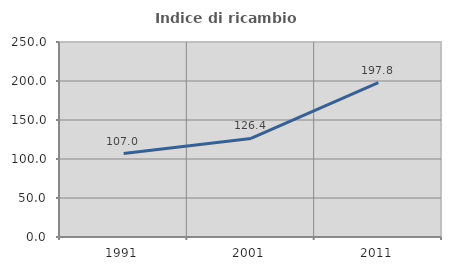
| Category | Indice di ricambio occupazionale  |
|---|---|
| 1991.0 | 106.967 |
| 2001.0 | 126.353 |
| 2011.0 | 197.758 |